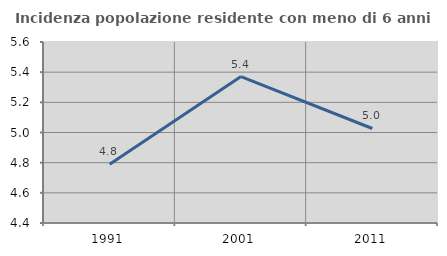
| Category | Incidenza popolazione residente con meno di 6 anni |
|---|---|
| 1991.0 | 4.789 |
| 2001.0 | 5.371 |
| 2011.0 | 5.027 |